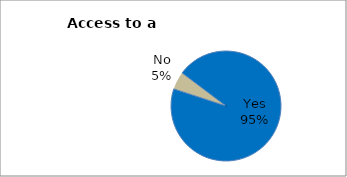
| Category | Series 0 |
|---|---|
| Yes | 94.756 |
| No | 5.244 |